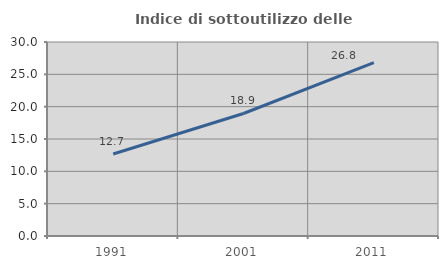
| Category | Indice di sottoutilizzo delle abitazioni  |
|---|---|
| 1991.0 | 12.688 |
| 2001.0 | 18.944 |
| 2011.0 | 26.809 |